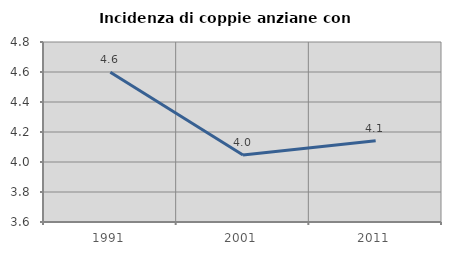
| Category | Incidenza di coppie anziane con figli |
|---|---|
| 1991.0 | 4.598 |
| 2001.0 | 4.046 |
| 2011.0 | 4.142 |